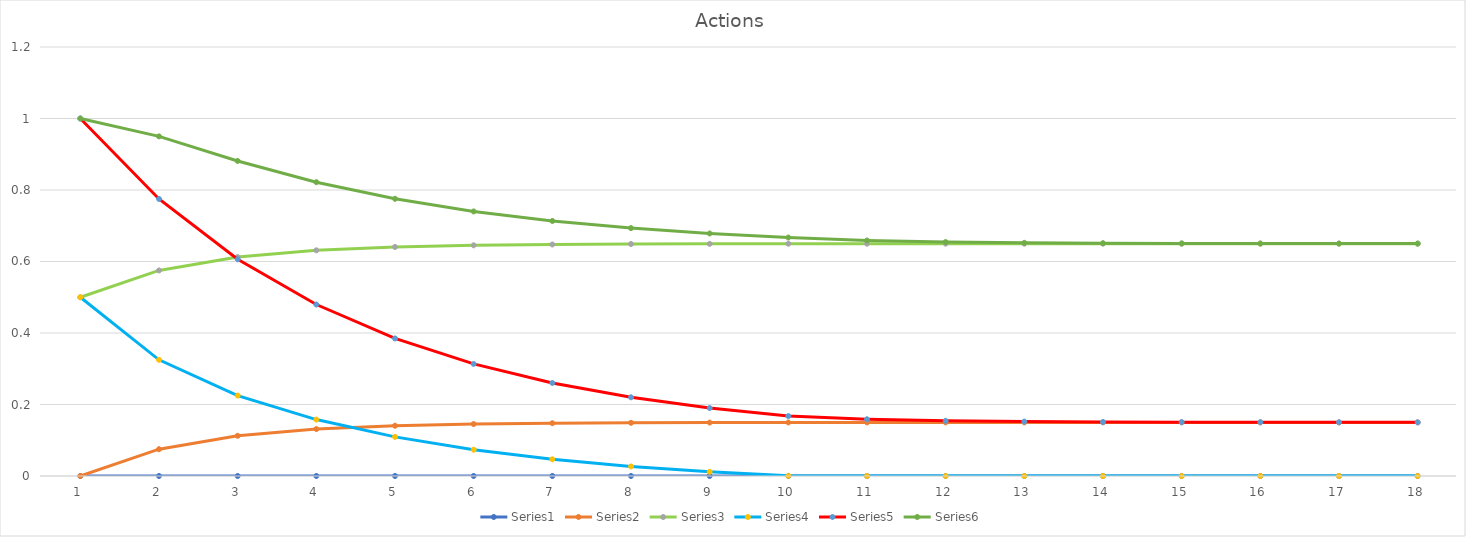
| Category | Series 0 | Series 1 | Series 2 | Series 3 | Series 4 | Series 5 |
|---|---|---|---|---|---|---|
| 0 | 0 | 0 | 0.5 | 0.5 | 1 | 1 |
| 1 | 0 | 0.075 | 0.575 | 0.325 | 0.775 | 0.95 |
| 2 | 0 | 0.112 | 0.612 | 0.225 | 0.606 | 0.881 |
| 3 | 0 | 0.131 | 0.631 | 0.158 | 0.48 | 0.822 |
| 4 | 0 | 0.141 | 0.641 | 0.109 | 0.385 | 0.775 |
| 5 | 0 | 0.145 | 0.645 | 0.074 | 0.314 | 0.74 |
| 6 | 0 | 0.148 | 0.648 | 0.047 | 0.26 | 0.713 |
| 7 | 0 | 0.149 | 0.649 | 0.027 | 0.22 | 0.693 |
| 8 | 0 | 0.149 | 0.649 | 0.012 | 0.19 | 0.678 |
| 9 | 0 | 0.15 | 0.65 | 0 | 0.168 | 0.667 |
| 10 | 0 | 0.15 | 0.65 | 0 | 0.159 | 0.659 |
| 11 | 0 | 0.15 | 0.65 | 0 | 0.154 | 0.654 |
| 12 | 0 | 0.15 | 0.65 | 0 | 0.152 | 0.652 |
| 13 | 0 | 0.15 | 0.65 | 0 | 0.151 | 0.651 |
| 14 | 0 | 0.15 | 0.65 | 0 | 0.151 | 0.651 |
| 15 | 0 | 0.15 | 0.65 | 0 | 0.15 | 0.65 |
| 16 | 0 | 0.15 | 0.65 | 0 | 0.15 | 0.65 |
| 17 | 0 | 0.15 | 0.65 | 0 | 0.15 | 0.65 |